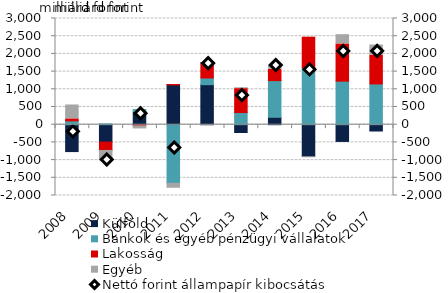
| Category | Külföld | Bankok és egyéb pénzügyi vállalatok | Lakosság | Egyéb |
|---|---|---|---|---|
| 2008.0 | -759.65 | 107.753 | 57.047 | 392.2 |
| 2009.0 | -491.4 | 23.556 | -236.156 | -293.241 |
| 2010.0 | 358.869 | 68.381 | -32.221 | -87.487 |
| 2011.0 | 1124.084 | -1656.51 | 11.985 | -139.476 |
| 2012.0 | 1130.805 | 189.835 | 433.858 | -29.175 |
| 2013.0 | -219.704 | 342.911 | 675.773 | 24.837 |
| 2014.0 | 209.723 | 1035.767 | 320.976 | 103.968 |
| 2015.0 | -901.505 | 1614.165 | 857.987 | -21.991 |
| 2016.0 | -472.926 | 1229.477 | 1051.766 | 261.126 |
| 2017.0 | -178.442 | 1151.054 | 813.833 | 286.152 |